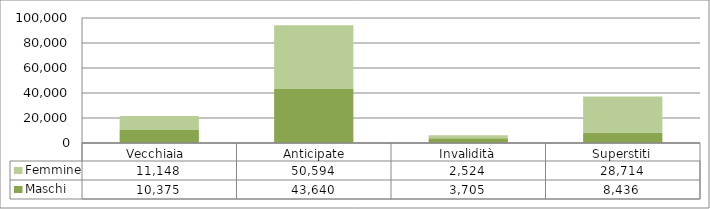
| Category | Maschi | Femmine |
|---|---|---|
| Vecchiaia  | 10375 | 11148 |
|  Anticipate | 43640 | 50594 |
| Invalidità | 3705 | 2524 |
| Superstiti | 8436 | 28714 |